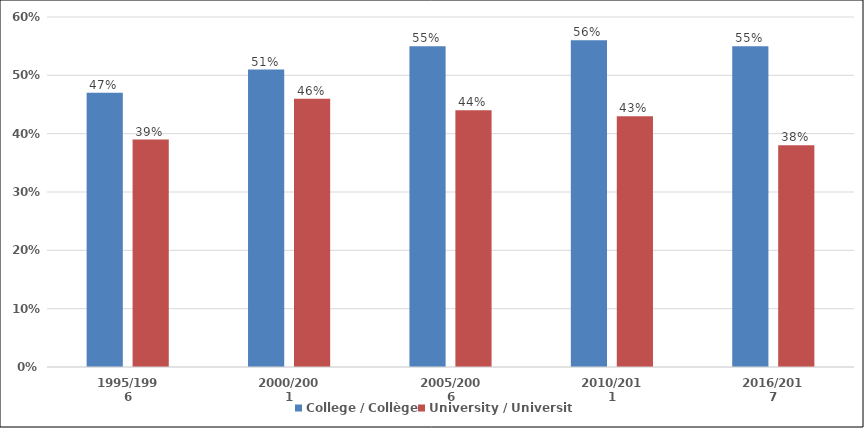
| Category | College / Collège | University / Université |
|---|---|---|
| 1995/1996 | 0.47 | 0.39 |
| 2000/2001 | 0.51 | 0.46 |
| 2005/2006 | 0.55 | 0.44 |
| 2010/2011 | 0.56 | 0.43 |
| 2016/2017 | 0.55 | 0.38 |